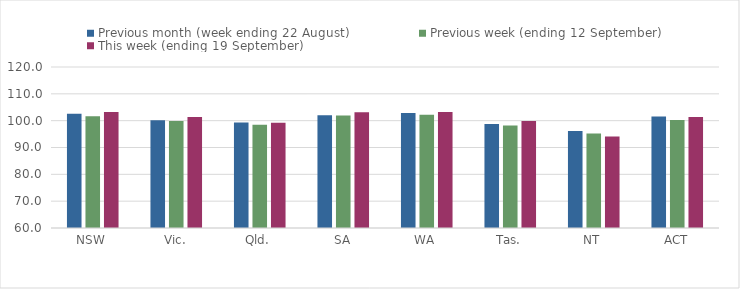
| Category | Previous month (week ending 22 August) | Previous week (ending 12 September) | This week (ending 19 September) |
|---|---|---|---|
| NSW | 102.55 | 101.69 | 103.24 |
| Vic. | 100.11 | 99.85 | 101.35 |
| Qld. | 99.28 | 98.51 | 99.2 |
| SA | 102.04 | 101.97 | 103.15 |
| WA | 102.82 | 102.18 | 103.25 |
| Tas. | 98.75 | 98.19 | 99.89 |
| NT | 96.12 | 95.26 | 94.09 |
| ACT | 101.59 | 100.21 | 101.37 |